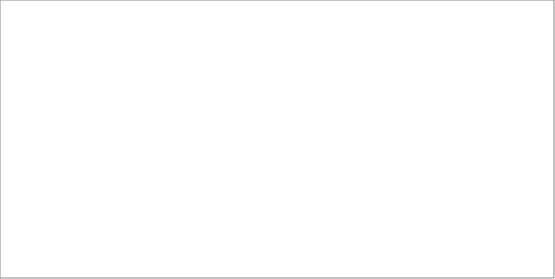
| Category | 2004 | 2005 | 2006 | 2008 | 2009 | 2010 | 2011 | 2012 | 2013 |
|---|---|---|---|---|---|---|---|---|---|
| dolnośląskie |  |  | 13104.58 | 38513.8 | 89881.28 | 215455.05 |  | 36774.5 | 11786.88 |